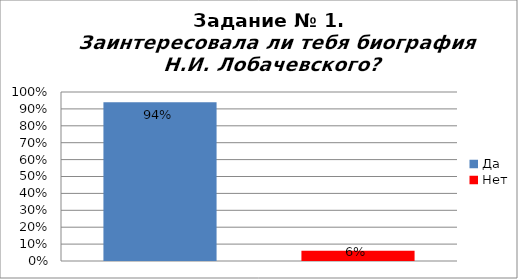
| Category | Заинтересовала ли тебя биография Н.И. Лобачевского? |
|---|---|
| Да | 0.94 |
| Нет | 0.06 |